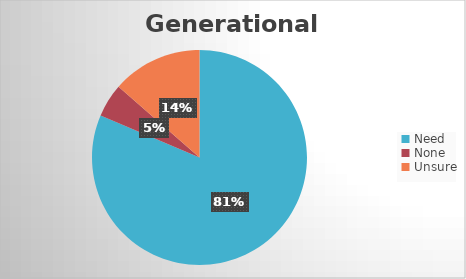
| Category | Series 0 |
|---|---|
| Need | 162 |
| None | 10 |
| Unsure | 27 |